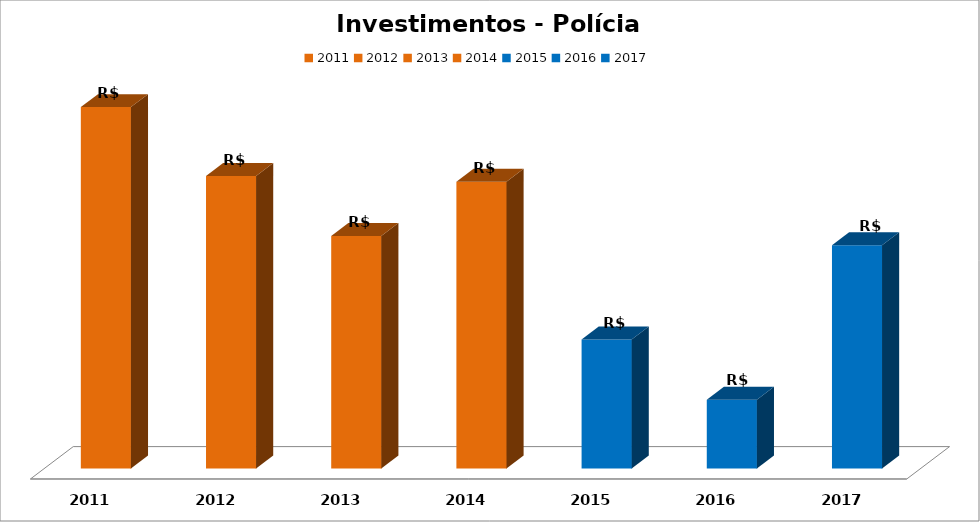
| Category | Series 1 |
|---|---|
| 2011.0 | 13838710.56 |
| 2012.0 | 11200196.61 |
| 2013.0 | 8902496.83 |
| 2014.0 | 10982422.47 |
| 2015.0 | 4936123.64 |
| 2016.0 | 2630670.83 |
| 2017.0 | 8547984.52 |